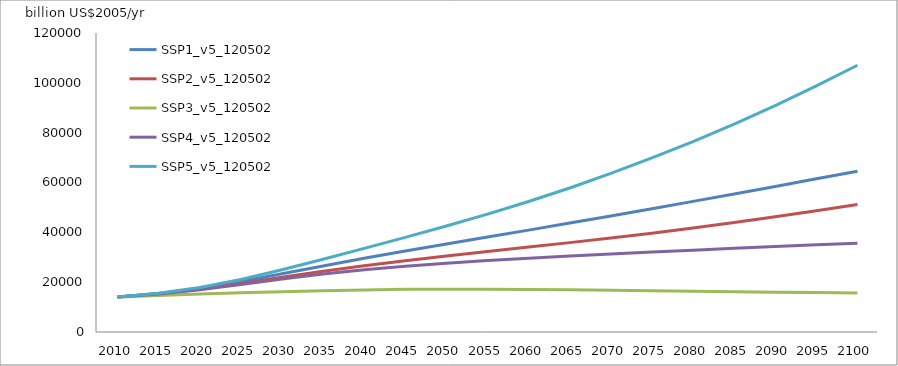
| Category | SSP1_v5_120502 | SSP2_v5_120502 | SSP3_v5_120502 | SSP4_v5_120502 | SSP5_v5_120502 |
|---|---|---|---|---|---|
| 2010.0 | 14005.044 | 14005.044 | 14005.044 | 14005.044 | 14005.044 |
| 2015.0 | 15455.843 | 15327.325 | 14674.616 | 15288.096 | 15527.154 |
| 2020.0 | 17528.348 | 17132.362 | 15206.018 | 16981.837 | 17835.722 |
| 2025.0 | 20279.066 | 19459.2 | 15729.241 | 19101.028 | 21084.776 |
| 2030.0 | 23351.364 | 21949.992 | 16196.413 | 21263.836 | 24957.596 |
| 2035.0 | 26495.186 | 24366.76 | 16587.99 | 23240.969 | 29180.96 |
| 2040.0 | 29559.966 | 26597.943 | 16898.381 | 24943.917 | 33549.147 |
| 2045.0 | 32498.125 | 28635.331 | 17115.504 | 26390.751 | 37984.321 |
| 2050.0 | 35338.178 | 30524.601 | 17203.36 | 27617.765 | 42556.184 |
| 2055.0 | 38113.897 | 32319.156 | 17182.643 | 28685.38 | 47317.307 |
| 2060.0 | 40890.84 | 34083.915 | 17081.025 | 29641.189 | 52372.638 |
| 2065.0 | 43718.524 | 35872.875 | 16929.54 | 30518.604 | 57805.297 |
| 2070.0 | 46593.668 | 37724.644 | 16744.381 | 31329.916 | 63640.05 |
| 2075.0 | 49496.191 | 39669.692 | 16545.61 | 32098.715 | 69852.791 |
| 2080.0 | 52430.603 | 41730.942 | 16347.857 | 32847.723 | 76446.148 |
| 2085.0 | 55406.51 | 43919.792 | 16161.695 | 33587.847 | 83453.518 |
| 2090.0 | 58428.172 | 46229.62 | 15992.075 | 34308.96 | 90893.814 |
| 2095.0 | 61478.605 | 48640.314 | 15839.092 | 34988.283 | 98761.133 |
| 2100.0 | 64547.125 | 51129.037 | 15697.94 | 35612.039 | 107055.933 |